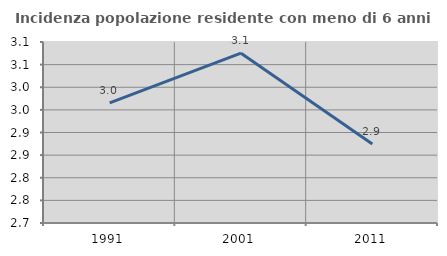
| Category | Incidenza popolazione residente con meno di 6 anni |
|---|---|
| 1991.0 | 2.966 |
| 2001.0 | 3.075 |
| 2011.0 | 2.875 |